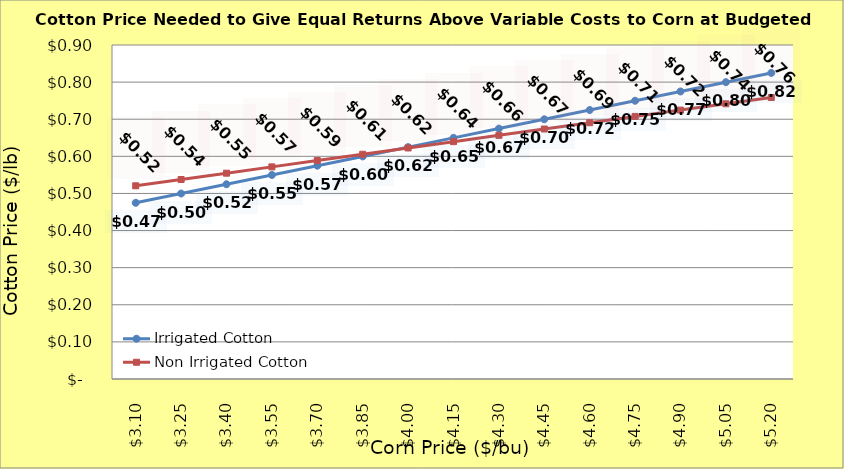
| Category | Irrigated Cotton | Non Irrigated Cotton |
|---|---|---|
| 3.1000000000000005 | 0.475 | 0.521 |
| 3.2500000000000004 | 0.5 | 0.538 |
| 3.4000000000000004 | 0.525 | 0.555 |
| 3.5500000000000003 | 0.55 | 0.572 |
| 3.7 | 0.575 | 0.589 |
| 3.85 | 0.6 | 0.606 |
| 4.0 | 0.625 | 0.623 |
| 4.15 | 0.65 | 0.64 |
| 4.300000000000001 | 0.675 | 0.657 |
| 4.450000000000001 | 0.7 | 0.674 |
| 4.600000000000001 | 0.725 | 0.691 |
| 4.750000000000002 | 0.75 | 0.708 |
| 4.900000000000002 | 0.775 | 0.725 |
| 5.0500000000000025 | 0.8 | 0.742 |
| 5.200000000000003 | 0.825 | 0.759 |